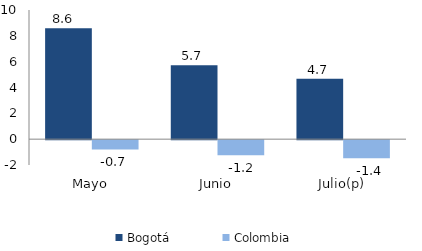
| Category | Bogotá | Colombia |
|---|---|---|
| Mayo | 8.589 | -0.719 |
| Junio | 5.724 | -1.162 |
| Julio(p) | 4.678 | -1.4 |